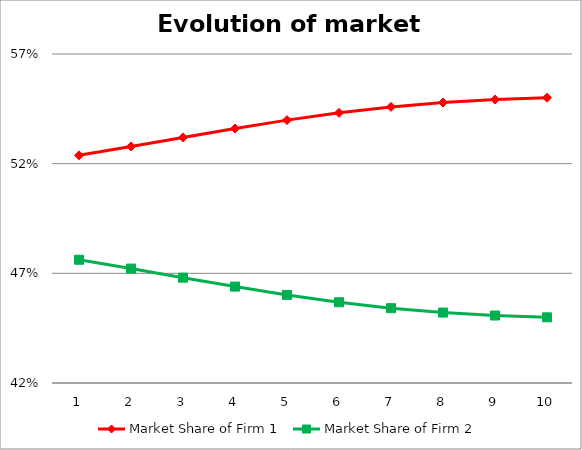
| Category | Market Share of Firm 1 | Market Share of Firm 2 |
|---|---|---|
| 0 | 0.524 | 0.476 |
| 1 | 0.528 | 0.472 |
| 2 | 0.532 | 0.468 |
| 3 | 0.536 | 0.464 |
| 4 | 0.54 | 0.46 |
| 5 | 0.543 | 0.457 |
| 6 | 0.546 | 0.454 |
| 7 | 0.548 | 0.452 |
| 8 | 0.549 | 0.451 |
| 9 | 0.55 | 0.45 |